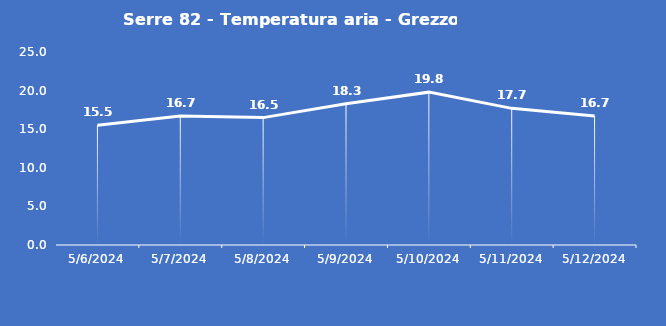
| Category | Serre 82 - Temperatura aria - Grezzo (°C) |
|---|---|
| 5/6/24 | 15.5 |
| 5/7/24 | 16.7 |
| 5/8/24 | 16.5 |
| 5/9/24 | 18.3 |
| 5/10/24 | 19.8 |
| 5/11/24 | 17.7 |
| 5/12/24 | 16.7 |